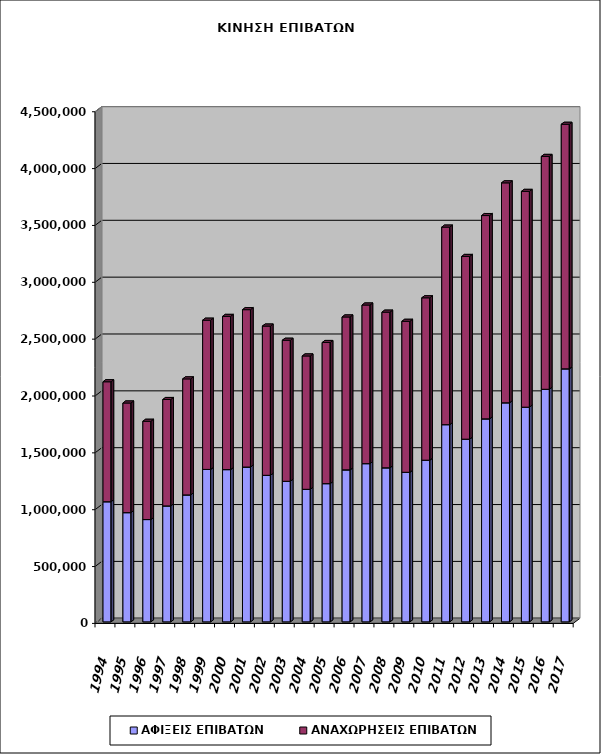
| Category | ΑΦΙΞΕΙΣ ΕΠΙΒΑΤΩΝ | ΑΝΑΧΩΡΗΣΕΙΣ ΕΠΙΒΑΤΩΝ |
|---|---|---|
| 1994.0 | 1056560 | 1055154 |
| 1995.0 | 960586 | 964336 |
| 1996.0 | 899809 | 864312 |
| 1997.0 | 1019876 | 935651 |
| 1998.0 | 1116611 | 1020417 |
| 1999.0 | 1340709 | 1312420 |
| 2000.0 | 1339139 | 1347351 |
| 2001.0 | 1361783 | 1383923 |
| 2002.0 | 1288923 | 1312723 |
| 2003.0 | 1236553 | 1240202 |
| 2004.0 | 1165843 | 1172807 |
| 2005.0 | 1215771 | 1241267 |
| 2006.0 | 1336884 | 1344673 |
| 2007.0 | 1391615 | 1395021 |
| 2008.0 | 1354921 | 1369019 |
| 2009.0 | 1315479 | 1327955 |
| 2010.0 | 1421955 | 1428051 |
| 2011.0 | 1734418 | 1737505 |
| 2012.0 | 1606843 | 1606937 |
| 2013.0 | 1785305 | 1788160 |
| 2014.0 | 1926675 | 1934341 |
| 2015.0 | 1888181 | 1897817 |
| 2016.0 | 2045555 | 2047953 |
| 2017.0 | 2225303 | 2150806 |